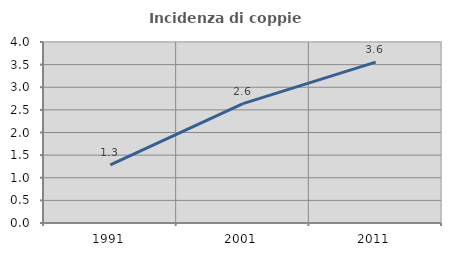
| Category | Incidenza di coppie miste |
|---|---|
| 1991.0 | 1.283 |
| 2001.0 | 2.637 |
| 2011.0 | 3.554 |